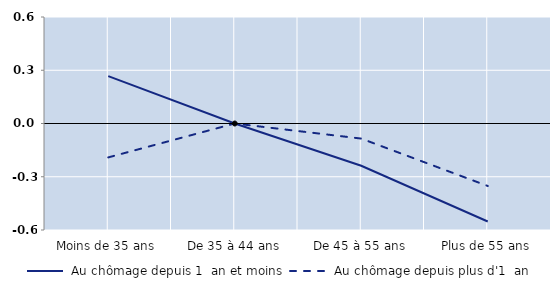
| Category |  Au chômage depuis 1  an et moins |  Au chômage depuis plus d'1  an |
|---|---|---|
| Moins de 35 ans | 0.267 | -0.191 |
| De 35 à 44 ans | 0 | 0 |
| De 45 à 55 ans | -0.238 | -0.085 |
| Plus de 55 ans | -0.552 | -0.352 |